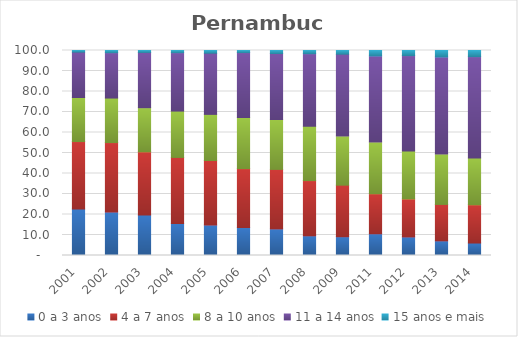
| Category | 0 a 3 anos | 4 a 7 anos | 8 a 10 anos | 11 a 14 anos | 15 anos e mais |
|---|---|---|---|---|---|
| 2001.0 | 22.68 | 32.91 | 21.47 | 22.14 | 0.8 |
| 2002.0 | 21.27 | 33.82 | 21.71 | 22.14 | 1.06 |
| 2003.0 | 19.7 | 30.88 | 21.51 | 26.96 | 0.96 |
| 2004.0 | 15.56 | 32.28 | 22.61 | 28.5 | 1.05 |
| 2005.0 | 14.93 | 31.42 | 22.49 | 29.84 | 1.32 |
| 2006.0 | 13.64 | 28.75 | 24.91 | 31.7 | 1 |
| 2007.0 | 12.99 | 29.01 | 24.38 | 32.15 | 1.47 |
| 2008.0 | 9.61 | 26.94 | 26.51 | 35.4 | 1.55 |
| 2009.0 | 9.16 | 25.15 | 24 | 39.89 | 1.8 |
| 2011.0 | 10.6 | 19.52 | 25.27 | 41.98 | 2.63 |
| 2012.0 | 9.06 | 18.54 | 23.35 | 46.56 | 2.49 |
| 2013.0 | 7.15 | 17.76 | 24.63 | 47.33 | 3.14 |
| 2014.0 | 6.08 | 18.66 | 22.8 | 49.47 | 2.99 |